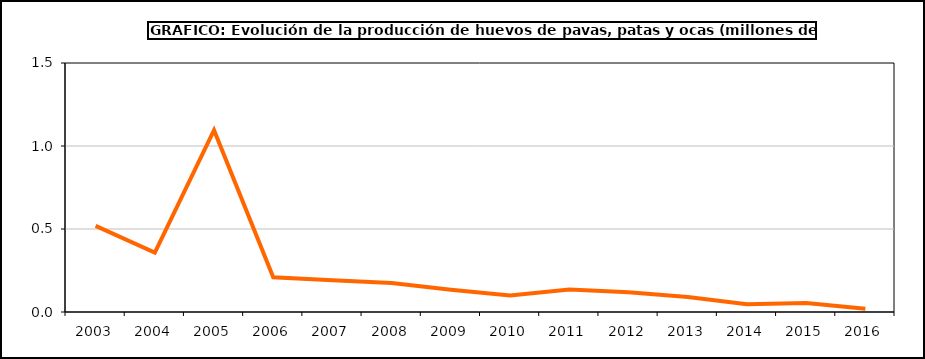
| Category | huevos |
|---|---|
| 2003.0 | 0.519 |
| 2004.0 | 0.358 |
| 2005.0 | 1.095 |
| 2006.0 | 0.209 |
| 2007.0 | 0.191 |
| 2008.0 | 0.174 |
| 2009.0 | 0.135 |
| 2010.0 | 0.1 |
| 2011.0 | 0.135 |
| 2012.0 | 0.119 |
| 2013.0 | 0.09 |
| 2014.0 | 0.047 |
| 2015.0 | 0.054 |
| 2016.0 | 0.019 |